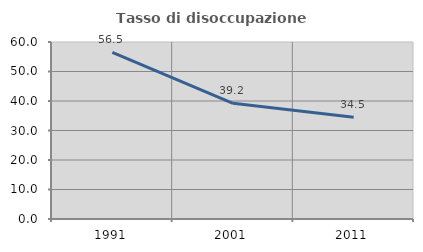
| Category | Tasso di disoccupazione giovanile  |
|---|---|
| 1991.0 | 56.478 |
| 2001.0 | 39.216 |
| 2011.0 | 34.524 |